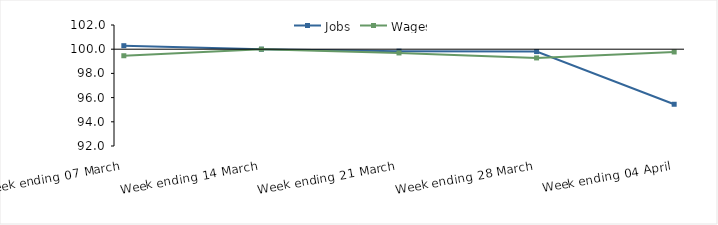
| Category | Jobs | Wages |
|---|---|---|
| 0 | 100.291 | 99.459 |
| 1900-01-01 | 100 | 100 |
| 1900-01-02 | 99.84 | 99.69 |
| 1900-01-03 | 99.804 | 99.278 |
| 1900-01-04 | 95.45 | 99.771 |